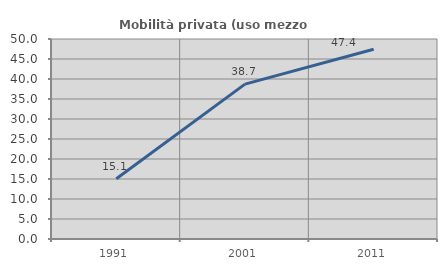
| Category | Mobilità privata (uso mezzo privato) |
|---|---|
| 1991.0 | 15.066 |
| 2001.0 | 38.721 |
| 2011.0 | 47.443 |